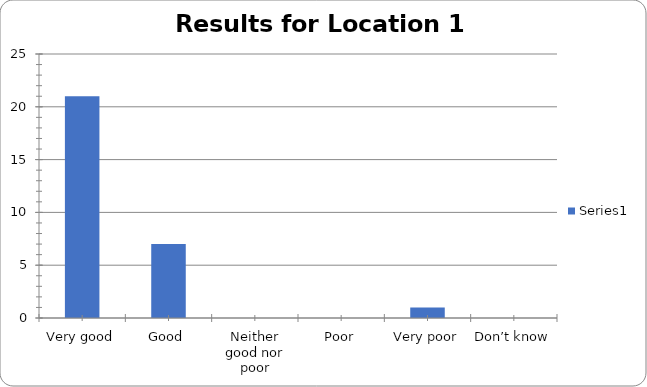
| Category | Series 0 |
|---|---|
| Very good | 21 |
| Good | 7 |
| Neither good nor poor | 0 |
| Poor | 0 |
| Very poor | 1 |
| Don’t know | 0 |